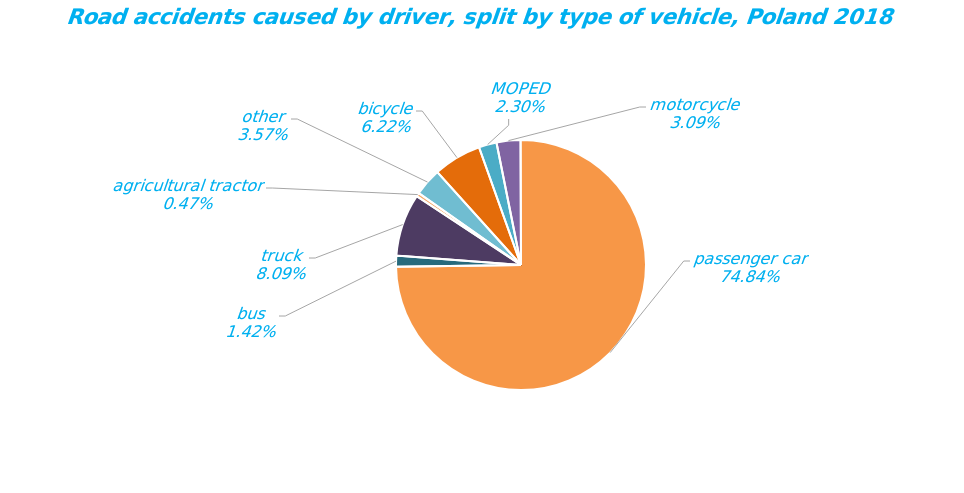
| Category | Series 0 |
|---|---|
| bicycle | 1713 |
| MOPED | 635 |
| motorcycle | 852 |
| passenger car | 20622 |
| bus | 391 |
| truck | 2228 |
| agricultural tractor | 130 |
| other | 985 |